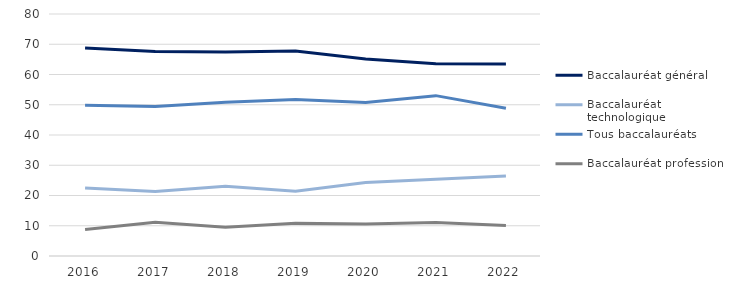
| Category | Baccalauréat général | Baccalauréat technologique | Tous baccalauréats | Baccalauréat professionnel |
|---|---|---|---|---|
| 2016 | 68.739 | 22.504 | 49.804 | 8.757 |
| 2017 | 67.593 | 21.286 | 49.42 | 11.121 |
| 2018 | 67.42 | 23.071 | 50.832 | 9.509 |
| 2019 | 67.803 | 21.412 | 51.723 | 10.785 |
| 2020 | 65.089 | 24.334 | 50.751 | 10.577 |
| 2021 | 63.588 | 25.36 | 53.01 | 11.052 |
| 2022 | 63.479 | 26.463 | 48.813 | 10.058 |